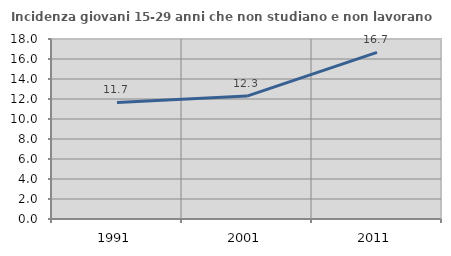
| Category | Incidenza giovani 15-29 anni che non studiano e non lavorano  |
|---|---|
| 1991.0 | 11.659 |
| 2001.0 | 12.295 |
| 2011.0 | 16.667 |